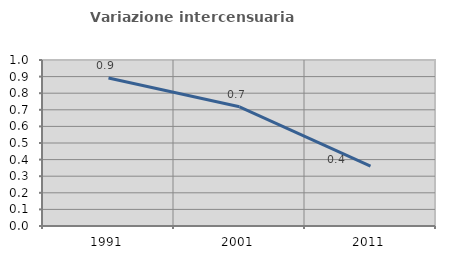
| Category | Variazione intercensuaria annua |
|---|---|
| 1991.0 | 0.892 |
| 2001.0 | 0.718 |
| 2011.0 | 0.361 |